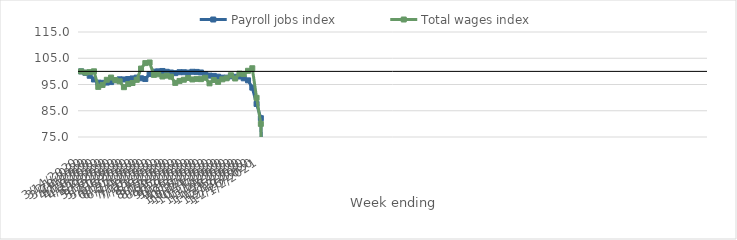
| Category | Payroll jobs index | Total wages index |
|---|---|---|
| 14/03/2020 | 100 | 100 |
| 21/03/2020 | 99.431 | 99.548 |
| 28/03/2020 | 98.329 | 99.712 |
| 04/04/2020 | 96.906 | 100.028 |
| 11/04/2020 | 95.704 | 94.087 |
| 18/04/2020 | 95.64 | 94.832 |
| 25/04/2020 | 95.735 | 96.796 |
| 02/05/2020 | 95.919 | 97.643 |
| 09/05/2020 | 96.609 | 96.667 |
| 16/05/2020 | 96.979 | 96.217 |
| 23/05/2020 | 96.911 | 93.978 |
| 30/05/2020 | 97.084 | 95.165 |
| 06/06/2020 | 97.309 | 95.57 |
| 13/06/2020 | 97.627 | 96.779 |
| 20/06/2020 | 97.375 | 101.067 |
| 27/06/2020 | 97.084 | 103.153 |
| 04/07/2020 | 98.981 | 103.384 |
| 11/07/2020 | 99.882 | 98.671 |
| 18/07/2020 | 100.006 | 98.877 |
| 25/07/2020 | 100.152 | 98.047 |
| 01/08/2020 | 99.84 | 98.375 |
| 08/08/2020 | 99.564 | 97.976 |
| 15/08/2020 | 99.326 | 95.616 |
| 22/08/2020 | 99.682 | 96.366 |
| 29/08/2020 | 99.674 | 96.816 |
| 05/09/2020 | 99.539 | 97.485 |
| 12/09/2020 | 99.841 | 96.92 |
| 19/09/2020 | 99.797 | 97.138 |
| 26/09/2020 | 99.582 | 97.045 |
| 03/10/2020 | 98.975 | 97.561 |
| 10/10/2020 | 98.391 | 95.441 |
| 17/10/2020 | 98.279 | 96.708 |
| 24/10/2020 | 97.98 | 95.998 |
| 31/10/2020 | 97.612 | 96.962 |
| 07/11/2020 | 97.609 | 97.366 |
| 14/11/2020 | 98.113 | 98.524 |
| 21/11/2020 | 97.938 | 97.293 |
| 28/11/2020 | 98.039 | 99.142 |
| 05/12/2020 | 97.356 | 98.982 |
| 12/12/2020 | 96.584 | 100.222 |
| 19/12/2020 | 93.801 | 101.188 |
| 26/12/2020 | 87.599 | 89.92 |
| 02/01/2021 | 82.166 | 79.994 |